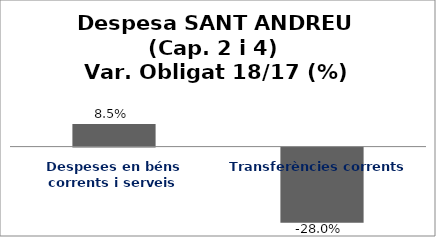
| Category | Series 0 |
|---|---|
| Despeses en béns corrents i serveis | 0.085 |
| Transferències corrents | -0.28 |